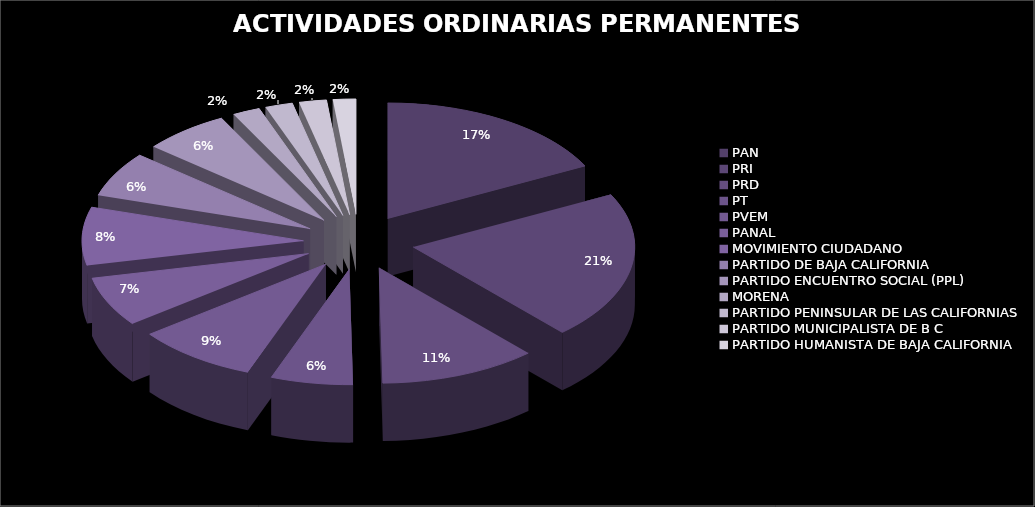
| Category | Series 0 |
|---|---|
| PAN | 20784744.33 |
| PRI | 24711167.67 |
| PRD | 13652172.37 |
| PT | 7118894.17 |
| PVEM | 10577688.51 |
| PANAL | 8271825.62 |
| MOVIMIENTO CIUDADANO | 9680092.95 |
| PARTIDO DE BAJA CALIFORNIA | 7503204.66 |
| PARTIDO ENCUENTRO SOCIAL (PPL) | 7503204.66 |
| MORENA | 2378404.22 |
| PARTIDO PENINSULAR DE LAS CALIFORNIAS | 2378404.22 |
| PARTIDO MUNICIPALISTA DE B C | 2378404.22 |
| PARTIDO HUMANISTA DE BAJA CALIFORNIA | 1982003.52 |